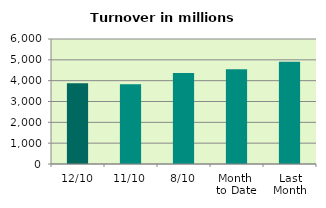
| Category | Series 0 |
|---|---|
| 12/10 | 3873.195 |
| 11/10 | 3824.483 |
| 8/10 | 4368.87 |
| Month 
to Date | 4542.295 |
| Last
Month | 4910.879 |